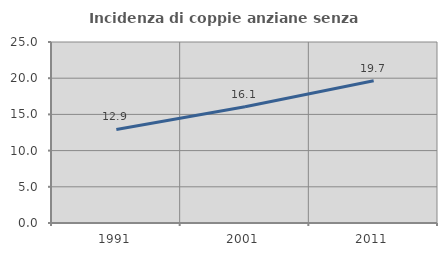
| Category | Incidenza di coppie anziane senza figli  |
|---|---|
| 1991.0 | 12.927 |
| 2001.0 | 16.054 |
| 2011.0 | 19.655 |